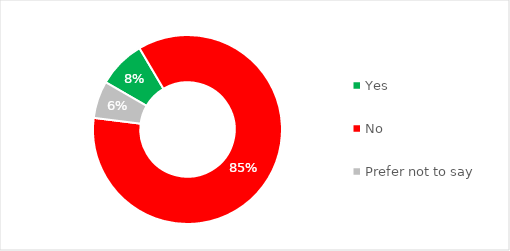
| Category | Series 0 |
|---|---|
| Yes | 0.082 |
| No | 0.855 |
| Prefer not to say | 0.064 |